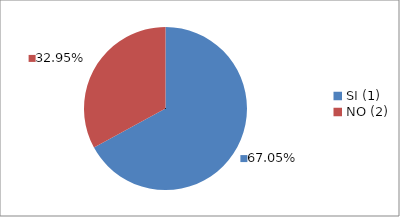
| Category | Series 0 |
|---|---|
| SI (1) | 0.67 |
| NO (2) | 0.33 |